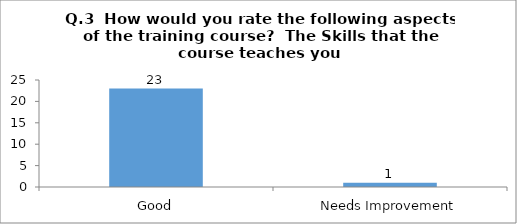
| Category | Q.3  How would you rate the following aspects of the training course?  |
|---|---|
| Good | 23 |
| Needs Improvement | 1 |